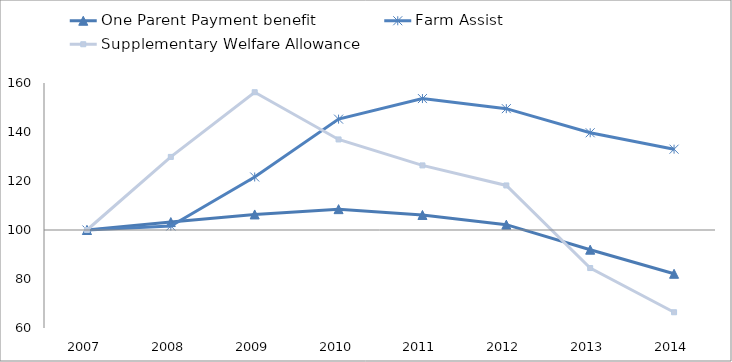
| Category | One Parent Payment benefit | Farm Assist | Supplementary Welfare Allowance  |
|---|---|---|---|
| 2007.0 | 100 | 100 | 100 |
| 2008.0 | 103.239 | 101.627 | 129.829 |
| 2009.0 | 106.347 | 121.638 | 156.233 |
| 2010.0 | 108.512 | 145.255 | 136.963 |
| 2011.0 | 106.139 | 153.647 | 126.363 |
| 2012.0 | 102.183 | 149.525 | 118.185 |
| 2013.0 | 91.963 | 139.683 | 84.47 |
| 2014.0 | 82.135 | 132.985 | 66.427 |